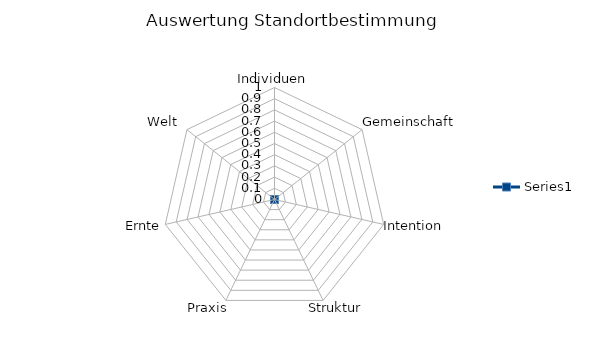
| Category | Series 0 |
|---|---|
| Individuen | 0 |
| Gemeinschaft | 0 |
| Intention | 0 |
| Struktur   | 0 |
| Praxis  | 0 |
| Ernte | 0 |
| Welt  | 0 |